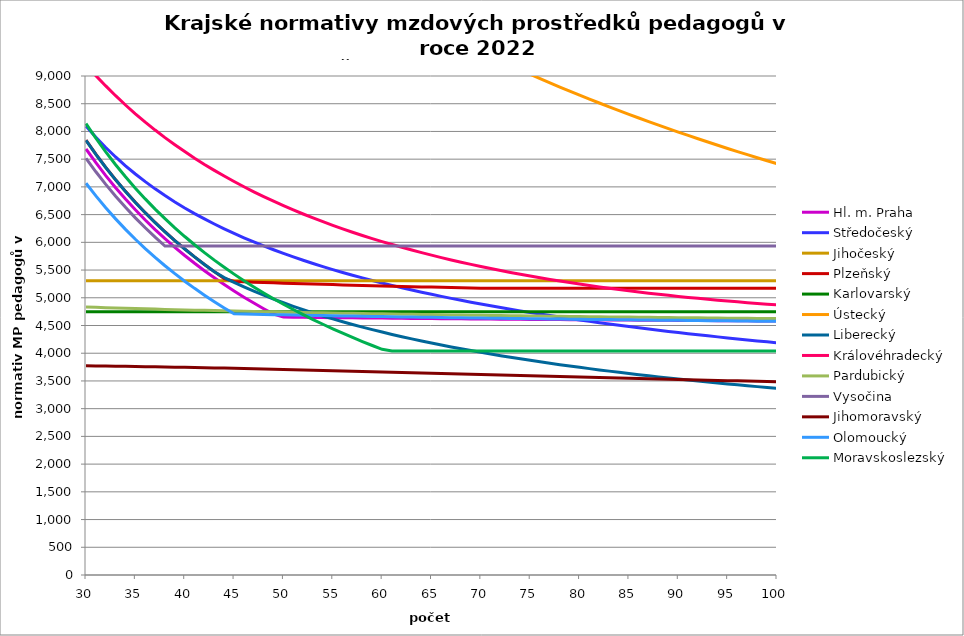
| Category | Hl. m. Praha | Středočeský | Jihočeský | Plzeňský | Karlovarský  | Ústecký   | Liberecký | Královéhradecký | Pardubický | Vysočina | Jihomoravský | Olomoucký | Moravskoslezský |
|---|---|---|---|---|---|---|---|---|---|---|---|---|---|
| 30.0 | 7684 | 8096.823 | 5305.814 | 7842 | 4750 | 14836.714 | 7840 | 9204.366 | 4833.222 | 7515 | 3772.114 | 7065.6 | 8140 |
| 31.0 | 7436.129 | 7896.129 | 5305.814 | 7589.032 | 4750 | 14627.746 | 7587.097 | 9006.076 | 4827.276 | 7272.581 | 3770.229 | 6837.677 | 7877.419 |
| 32.0 | 7203.75 | 7711.065 | 5305.814 | 7351.875 | 4750 | 14424.583 | 7350 | 8820.92 | 4821.532 | 7045.312 | 3768.032 | 6624 | 7631.25 |
| 33.0 | 6985.455 | 7539.791 | 5305.814 | 7129.091 | 4750 | 14226.986 | 7127.273 | 8644.751 | 4815.978 | 6831.818 | 3765.837 | 6423.273 | 7400 |
| 34.0 | 6780 | 7380.749 | 5305.814 | 6919.412 | 4750 | 14034.73 | 6917.647 | 8476.95 | 4810.602 | 6630.882 | 3763.333 | 6234.353 | 7182.353 |
| 35.0 | 6586.286 | 7232.608 | 5305.814 | 6721.714 | 4750 | 13847.6 | 6720 | 8318.367 | 4805.393 | 6441.429 | 3760.831 | 6056.229 | 6977.143 |
| 36.0 | 6403.333 | 7094.23 | 5305.814 | 6535 | 4750 | 13665.395 | 6533.333 | 8168.337 | 4800.342 | 6262.5 | 3758.021 | 5888 | 6783.333 |
| 37.0 | 6230.27 | 6964.63 | 5305.814 | 6358.378 | 4750 | 13487.922 | 6356.757 | 8024.938 | 4795.439 | 6093.243 | 3755.214 | 5728.865 | 6600 |
| 38.0 | 6066.316 | 6842.955 | 5305.814 | 6191.053 | 4750 | 13315 | 6189.474 | 7889.032 | 4790.677 | 5932.895 | 3752.101 | 5578.105 | 6426.316 |
| 39.0 | 5910.769 | 6728.459 | 5305.814 | 6032.308 | 4750 | 13146.456 | 6030.769 | 7760.114 | 4786.047 | 5932.895 | 3748.994 | 5435.077 | 6261.538 |
| 40.0 | 5763 | 6620.49 | 5305.814 | 5881.5 | 4750 | 12982.125 | 5880 | 7636.534 | 4781.544 | 5932.895 | 3745.581 | 5299.2 | 6105 |
| 41.0 | 5622.439 | 6518.474 | 5305.814 | 5738.049 | 4750 | 12821.852 | 5736.585 | 7517.983 | 4777.159 | 5932.895 | 3742.174 | 5169.951 | 5956.098 |
| 42.0 | 5488.571 | 6421.902 | 5305.814 | 5601.429 | 4750 | 12665.488 | 5600 | 7405.299 | 4772.888 | 5932.895 | 3738.774 | 5046.857 | 5814.286 |
| 43.0 | 5360.93 | 6330.325 | 5305.814 | 5471.163 | 4750 | 12512.892 | 5469.767 | 7298.12 | 4768.725 | 5932.895 | 3735.072 | 4929.488 | 5679.07 |
| 44.0 | 5239.091 | 6243.341 | 5305.814 | 5346.818 | 4750 | 12363.929 | 5363.391 | 7195.057 | 4764.665 | 5932.895 | 3731.377 | 4817.455 | 5550 |
| 45.0 | 5122.667 | 6160.592 | 5305.814 | 5293.284 | 4750 | 12218.471 | 5277.689 | 7096.924 | 4760.703 | 5932.895 | 3727.689 | 4710.4 | 5426.667 |
| 46.0 | 5011.304 | 6081.756 | 5305.814 | 5287.336 | 4750 | 12076.395 | 5196.479 | 7002.434 | 4756.834 | 5932.895 | 3723.702 | 4706.739 | 5308.696 |
| 47.0 | 4904.681 | 6006.544 | 5305.814 | 5280.808 | 4750 | 11937.586 | 5119.399 | 6911.403 | 4753.054 | 5932.895 | 3719.724 | 4703.084 | 5195.745 |
| 48.0 | 4802.5 | 5934.697 | 5305.814 | 5274.888 | 4750 | 11801.932 | 5046.125 | 6824.613 | 4749.36 | 5932.895 | 3715.754 | 4699.435 | 5087.5 |
| 49.0 | 4704.49 | 5865.977 | 5305.814 | 5269.571 | 4750 | 11669.326 | 4976.367 | 6741.833 | 4745.747 | 5932.895 | 3711.488 | 4695.791 | 4983.673 |
| 50.0 | 4651.801 | 5800.173 | 5305.814 | 5263.676 | 4750 | 11539.667 | 4909.865 | 6661.945 | 4742.213 | 5932.895 | 3707.536 | 4692.153 | 4884 |
| 51.0 | 4649.924 | 5737.088 | 5305.814 | 5258.382 | 4750 | 11412.857 | 4846.381 | 6584.814 | 4738.754 | 5932.895 | 3703.289 | 4688.52 | 4788.235 |
| 52.0 | 4648.049 | 5676.547 | 5305.814 | 5253.098 | 4750 | 11288.804 | 4785.705 | 6511.182 | 4735.367 | 5932.895 | 3698.75 | 4685.411 | 4696.154 |
| 53.0 | 4646.176 | 5618.388 | 5305.814 | 5247.825 | 4750 | 11167.419 | 4727.643 | 6440.026 | 4732.049 | 5932.895 | 3694.523 | 4682.306 | 4607.547 |
| 54.0 | 4643.836 | 5562.464 | 5305.814 | 5242.563 | 4750 | 11048.617 | 4672.019 | 6372.069 | 4728.798 | 5932.895 | 3690.005 | 4678.689 | 4522.222 |
| 55.0 | 4641.965 | 5508.637 | 5305.814 | 5237.894 | 4750 | 10932.316 | 4618.675 | 6306.343 | 4725.611 | 5932.895 | 3685.498 | 4675.593 | 4440 |
| 56.0 | 4640.097 | 5456.785 | 5305.814 | 5232.651 | 4750 | 10818.437 | 4567.464 | 6243.554 | 4722.485 | 5932.895 | 3681.002 | 4672.501 | 4360.714 |
| 57.0 | 4638.696 | 5406.793 | 5305.814 | 5228 | 4750 | 10706.907 | 4518.254 | 6182.002 | 4719.419 | 5932.895 | 3676.517 | 4669.413 | 4284.211 |
| 58.0 | 4636.83 | 5358.554 | 5305.814 | 5223.357 | 4750 | 10597.653 | 4470.921 | 6123.951 | 4716.41 | 5932.895 | 3672.043 | 4666.843 | 4210.345 |
| 59.0 | 4634.965 | 5311.971 | 5305.814 | 5218.722 | 4750 | 10490.606 | 4425.354 | 6066.981 | 4713.456 | 5932.895 | 3667.282 | 4663.762 | 4138.983 |
| 60.0 | 4633.102 | 5266.954 | 5305.814 | 5214.096 | 4750 | 10385.7 | 4381.45 | 6012.538 | 4710.555 | 5932.895 | 3662.831 | 4660.686 | 4070 |
| 61.0 | 4631.706 | 5223.42 | 5305.814 | 5209.477 | 4750 | 10282.871 | 4339.113 | 5960.517 | 4707.706 | 5932.895 | 3658.094 | 4658.125 | 4040.705 |
| 62.0 | 4629.845 | 5181.289 | 5305.814 | 5204.867 | 4750 | 10182.059 | 4298.255 | 5910.101 | 4704.906 | 5932.895 | 3653.37 | 4655.057 | 4040.705 |
| 63.0 | 4628.451 | 5140.491 | 5305.814 | 5200.84 | 4750 | 10083.204 | 4258.795 | 5861.234 | 4702.155 | 5932.895 | 3648.658 | 4652.502 | 4040.705 |
| 64.0 | 4626.593 | 5100.959 | 5305.814 | 5196.245 | 4750 | 9986.25 | 4220.657 | 5813.86 | 4699.45 | 5932.895 | 3643.958 | 4649.951 | 4040.705 |
| 65.0 | 4625.201 | 5062.628 | 5305.814 | 5192.231 | 4750 | 9891.143 | 4183.772 | 5768.605 | 4696.79 | 5932.895 | 3639.27 | 4647.402 | 4040.705 |
| 66.0 | 4623.345 | 5025.442 | 5305.814 | 5188.224 | 4750 | 9797.83 | 4148.076 | 5724.719 | 4694.173 | 5932.895 | 3634.594 | 4644.347 | 4040.705 |
| 67.0 | 4621.955 | 4989.345 | 5305.814 | 5184.222 | 4750 | 9706.262 | 4113.506 | 5682.156 | 4691.599 | 5932.895 | 3629.93 | 4641.804 | 4040.705 |
| 68.0 | 4620.565 | 4954.286 | 5305.814 | 5180.227 | 4750 | 9616.389 | 4080.007 | 5641.522 | 4689.065 | 5932.895 | 3625.278 | 4639.772 | 4040.705 |
| 69.0 | 4618.714 | 4920.218 | 5305.814 | 5176.238 | 4750 | 9528.165 | 4047.527 | 5602.107 | 4686.572 | 5932.895 | 3620.638 | 4637.235 | 4040.705 |
| 70.0 | 4617.326 | 4887.095 | 5305.814 | 5172.255 | 4750 | 9441.545 | 4016.017 | 5563.872 | 4684.116 | 5932.895 | 3615.721 | 4634.7 | 4040.705 |
| 71.0 | 4615.939 | 4854.876 | 5305.814 | 5170.549 | 4750 | 9356.486 | 3985.429 | 5526.78 | 4681.699 | 5932.895 | 3611.106 | 4632.168 | 4040.705 |
| 72.0 | 4614.553 | 4823.521 | 5305.814 | 5170.549 | 4750 | 9272.946 | 3955.723 | 5491.411 | 4679.317 | 5932.895 | 3606.502 | 4629.639 | 4040.705 |
| 73.0 | 4613.168 | 4792.992 | 5305.814 | 5170.549 | 4750 | 9190.885 | 3926.857 | 5457.101 | 4676.97 | 5932.895 | 3601.623 | 4627.617 | 4040.705 |
| 74.0 | 4611.784 | 4763.255 | 5305.814 | 5170.549 | 4750 | 9110.263 | 3898.793 | 5423.819 | 4674.658 | 5932.895 | 3597.044 | 4625.093 | 4040.705 |
| 75.0 | 4610.4 | 4734.277 | 5305.814 | 5170.549 | 4750 | 9031.043 | 3871.497 | 5392.129 | 4672.379 | 5932.895 | 3592.476 | 4623.075 | 4040.705 |
| 76.0 | 4609.017 | 4706.026 | 5305.814 | 5170.549 | 4750 | 8953.19 | 3844.934 | 5360.807 | 4670.133 | 5932.895 | 3587.635 | 4620.556 | 4040.705 |
| 77.0 | 4607.635 | 4678.473 | 5305.814 | 5170.549 | 4750 | 8876.667 | 3819.073 | 5331.008 | 4667.918 | 5932.895 | 3583.091 | 4618.542 | 4040.705 |
| 78.0 | 4606.715 | 4651.59 | 5305.814 | 5170.549 | 4750 | 8801.441 | 3793.885 | 5302.114 | 4665.733 | 5932.895 | 3578.558 | 4616.531 | 4040.705 |
| 79.0 | 4605.334 | 4625.351 | 5305.814 | 5170.549 | 4750 | 8727.479 | 3769.341 | 5274.1 | 4663.579 | 5932.895 | 3574.037 | 4614.521 | 4040.705 |
| 80.0 | 4603.954 | 4599.731 | 5305.814 | 5170.549 | 4750 | 8654.75 | 3745.416 | 5247.506 | 4661.453 | 5932.895 | 3569.527 | 4612.01 | 4040.705 |
| 81.0 | 4602.576 | 4574.706 | 5305.814 | 5170.549 | 4750 | 8583.223 | 3722.085 | 5221.178 | 4659.356 | 5932.895 | 3565.028 | 4610.004 | 4040.705 |
| 82.0 | 4601.657 | 4550.254 | 5305.814 | 5170.549 | 4750 | 8512.869 | 3699.323 | 5196.218 | 4657.286 | 5932.895 | 3560.541 | 4608 | 4040.705 |
| 83.0 | 4600.279 | 4526.354 | 5305.814 | 5170.549 | 4750 | 8443.659 | 3677.109 | 5172.042 | 4655.243 | 5932.895 | 3556.065 | 4605.997 | 4040.705 |
| 84.0 | 4598.903 | 4502.985 | 5305.814 | 5170.549 | 4750 | 8375.565 | 3655.421 | 5148.632 | 4653.227 | 5932.895 | 3551.601 | 4603.997 | 4040.705 |
| 85.0 | 4597.985 | 4480.129 | 5305.814 | 5170.549 | 4750 | 8308.56 | 3634.24 | 5126.507 | 4651.236 | 5932.895 | 3547.147 | 4601.997 | 4040.705 |
| 86.0 | 4596.61 | 4457.767 | 5305.814 | 5170.549 | 4750 | 8242.619 | 3613.546 | 5104.571 | 4649.27 | 5932.895 | 3542.705 | 4600 | 4040.705 |
| 87.0 | 4595.694 | 4435.881 | 5305.814 | 5170.549 | 4750 | 8177.717 | 3593.322 | 5083.351 | 4647.328 | 5932.895 | 3538.551 | 4598.004 | 4040.705 |
| 88.0 | 4594.32 | 4414.456 | 5305.814 | 5170.549 | 4750 | 8113.828 | 3573.551 | 5063.354 | 4645.41 | 5932.895 | 3534.13 | 4596.509 | 4040.705 |
| 89.0 | 4592.947 | 4393.476 | 5305.814 | 5170.549 | 4750 | 8050.93 | 3554.215 | 5044.034 | 4643.516 | 5932.895 | 3529.995 | 4594.516 | 4040.705 |
| 90.0 | 4592.032 | 4372.925 | 5305.814 | 5170.549 | 4750 | 7989 | 3535.3 | 5024.861 | 4641.644 | 5932.895 | 3525.596 | 4592.525 | 4040.705 |
| 91.0 | 4591.117 | 4352.79 | 5305.814 | 5170.549 | 4750 | 7928.015 | 3516.792 | 5006.858 | 4639.794 | 5932.895 | 3521.481 | 4590.536 | 4040.705 |
| 92.0 | 4589.746 | 4333.056 | 5305.814 | 5170.549 | 4750 | 7867.955 | 3498.675 | 4989.493 | 4637.966 | 5932.895 | 3517.376 | 4589.045 | 4040.705 |
| 93.0 | 4588.832 | 4313.711 | 5305.814 | 5170.549 | 4750 | 7808.797 | 3480.937 | 4972.753 | 4636.159 | 5932.895 | 3513.281 | 4587.059 | 4040.705 |
| 94.0 | 4587.463 | 4294.741 | 5305.814 | 5170.549 | 4750 | 7750.522 | 3463.564 | 4956.627 | 4634.373 | 5932.895 | 3509.195 | 4585.571 | 4040.705 |
| 95.0 | 4586.55 | 4276.137 | 5305.814 | 5170.549 | 4750 | 7693.111 | 3446.545 | 4941.604 | 4632.607 | 5932.895 | 3505.119 | 4583.587 | 4040.705 |
| 96.0 | 4585.638 | 4257.884 | 5305.814 | 5170.549 | 4750 | 7636.544 | 3429.869 | 4926.672 | 4630.86 | 5932.895 | 3501.323 | 4582.101 | 4040.705 |
| 97.0 | 4584.726 | 4239.974 | 5305.814 | 5170.549 | 4750 | 7580.803 | 3413.523 | 4912.323 | 4629.134 | 5932.895 | 3497.265 | 4580.121 | 4040.705 |
| 98.0 | 4583.358 | 4222.396 | 5305.814 | 5170.549 | 4750 | 7525.87 | 3397.497 | 4898.548 | 4627.426 | 5932.895 | 3493.486 | 4578.637 | 4040.705 |
| 99.0 | 4582.447 | 4205.138 | 5305.814 | 5170.549 | 4750 | 7471.727 | 3381.782 | 4885.338 | 4625.737 | 5932.895 | 3489.446 | 4576.66 | 4040.705 |
| 100.0 | 4580.626 | 4188.193 | 5305.814 | 5170.549 | 4750 | 7418.357 | 3366.367 | 4873.169 | 4624.066 | 5932.895 | 3485.683 | 4575.178 | 4040.705 |